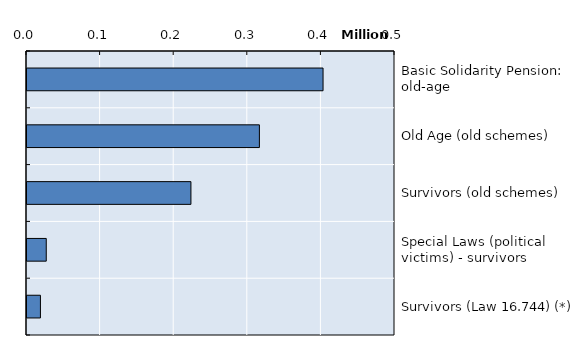
| Category | Series 0 |
|---|---|
| Basic Solidarity Pension: old-age | 402249.25 |
| Old Age (old schemes) | 315767.833 |
| Survivors (old schemes) | 222733.25 |
| Special Laws (political victims) - survivors | 26160 |
| Survivors (Law 16.744) (*) | 18245.083 |